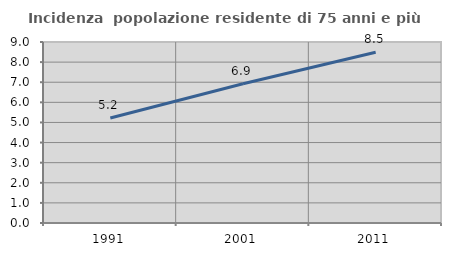
| Category | Incidenza  popolazione residente di 75 anni e più |
|---|---|
| 1991.0 | 5.224 |
| 2001.0 | 6.925 |
| 2011.0 | 8.487 |